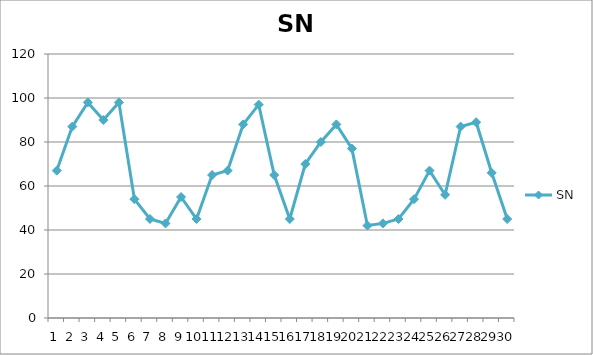
| Category | SN |
|---|---|
| 0 | 67 |
| 1 | 87 |
| 2 | 98 |
| 3 | 90 |
| 4 | 98 |
| 5 | 54 |
| 6 | 45 |
| 7 | 43 |
| 8 | 55 |
| 9 | 45 |
| 10 | 65 |
| 11 | 67 |
| 12 | 88 |
| 13 | 97 |
| 14 | 65 |
| 15 | 45 |
| 16 | 70 |
| 17 | 80 |
| 18 | 88 |
| 19 | 77 |
| 20 | 42 |
| 21 | 43 |
| 22 | 45 |
| 23 | 54 |
| 24 | 67 |
| 25 | 56 |
| 26 | 87 |
| 27 | 89 |
| 28 | 66 |
| 29 | 45 |